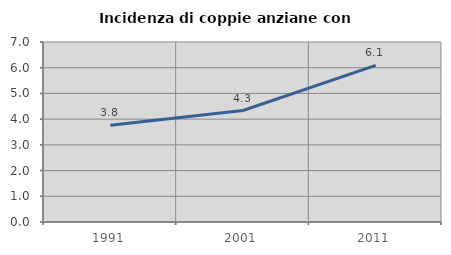
| Category | Incidenza di coppie anziane con figli |
|---|---|
| 1991.0 | 3.759 |
| 2001.0 | 4.335 |
| 2011.0 | 6.091 |